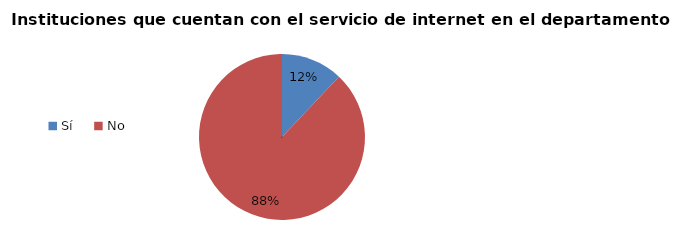
| Category | Series 0 |
|---|---|
| Sí | 0.121 |
| No | 0.879 |